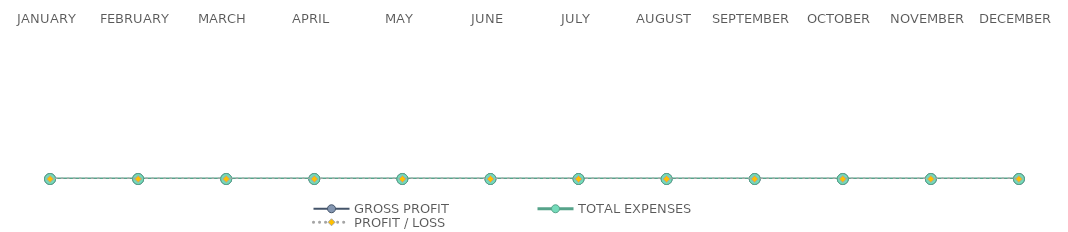
| Category | GROSS PROFIT | TOTAL EXPENSES | PROFIT / LOSS |
|---|---|---|---|
| JANUARY | 0 | 0 | 0 |
| FEBRUARY | 0 | 0 | 0 |
| MARCH | 0 | 0 | 0 |
| APRIL | 0 | 0 | 0 |
| MAY | 0 | 0 | 0 |
| JUNE | 0 | 0 | 0 |
| JULY | 0 | 0 | 0 |
| AUGUST | 0 | 0 | 0 |
| SEPTEMBER | 0 | 0 | 0 |
| OCTOBER | 0 | 0 | 0 |
| NOVEMBER | 0 | 0 | 0 |
| DECEMBER | 0 | 0 | 0 |